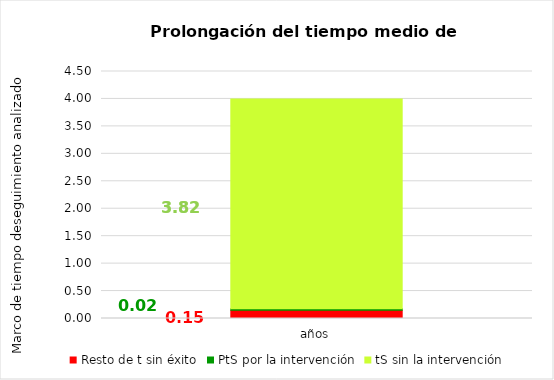
| Category | Resto de t sin éxito | PtS por la intervención | tS sin la intervención |
|---|---|---|---|
| años | 0.151 | 0.024 | 3.825 |